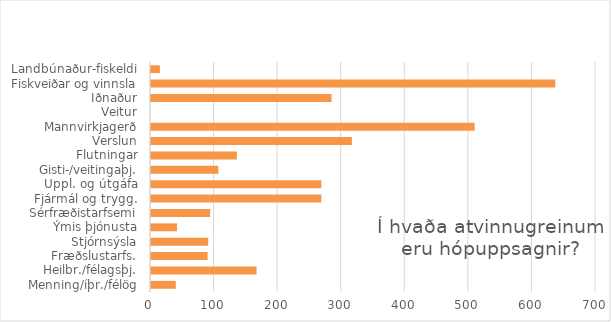
| Category | Series 0 |
|---|---|
| Landbúnaður-fiskeldi | 14 |
| Fiskveiðar og vinnsla | 636 |
| Iðnaður | 284 |
| Veitur | 0 |
| Mannvirkjagerð | 509 |
| Verslun | 316 |
| Flutningar | 135 |
| Gisti-/veitingaþj. | 106 |
| Uppl. og útgáfa | 268 |
| Fjármál og trygg. | 268 |
| Sérfræðistarfsemi | 93 |
| Ýmis þjónusta | 41 |
| Stjórnsýsla | 90 |
| Fræðslustarfs. | 89 |
| Heilbr./félagsþj. | 166 |
| Menning/íþr./félög | 39 |